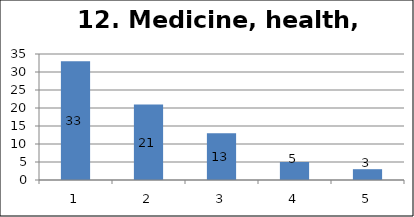
| Category | Series 1 |
|---|---|
| 0 | 33 |
| 1 | 21 |
| 2 | 13 |
| 3 | 5 |
| 4 | 3 |